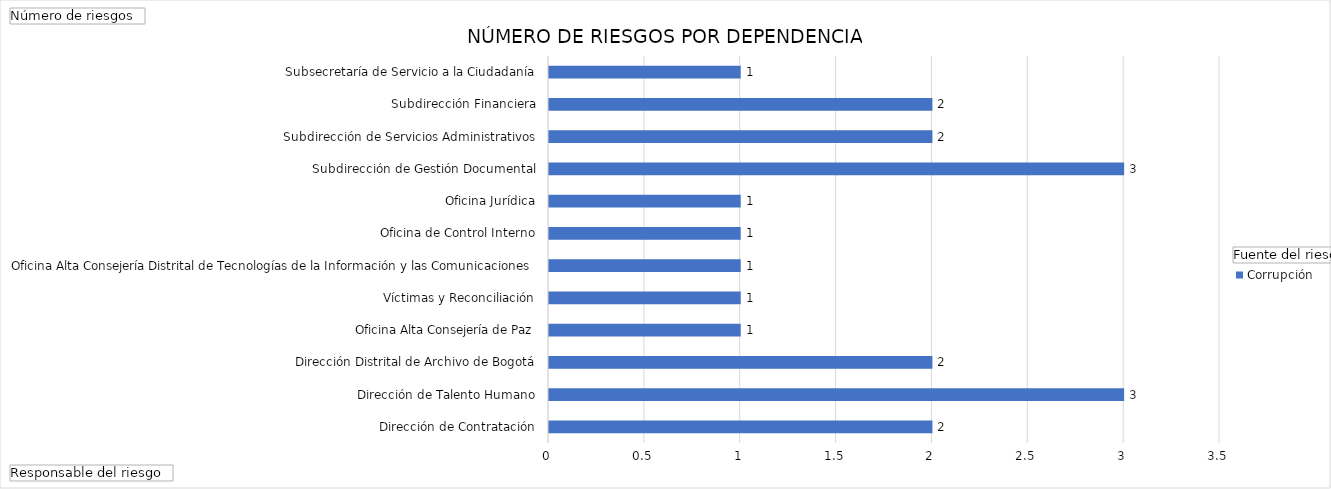
| Category | Corrupción |
|---|---|
| Dirección de Contratación | 2 |
| Dirección de Talento Humano | 3 |
| Dirección Distrital de Archivo de Bogotá | 2 |
| Oficina Alta Consejería de Paz, Víctimas y Reconciliación | 1 |
| Oficina Alta Consejería Distrital de Tecnologías de la Información y las Comunicaciones | 1 |
| Oficina de Control Interno | 1 |
| Oficina Jurídica | 1 |
| Subdirección de Gestión Documental | 1 |
| Subdirección de Servicios Administrativos | 3 |
| Subdirección Financiera | 2 |
| Subsecretaría de Servicio a la Ciudadanía | 2 |
| Oficina de Control Disciplinario Interno, Oficina Jurídica y Despacho de la Secretaría General. | 1 |